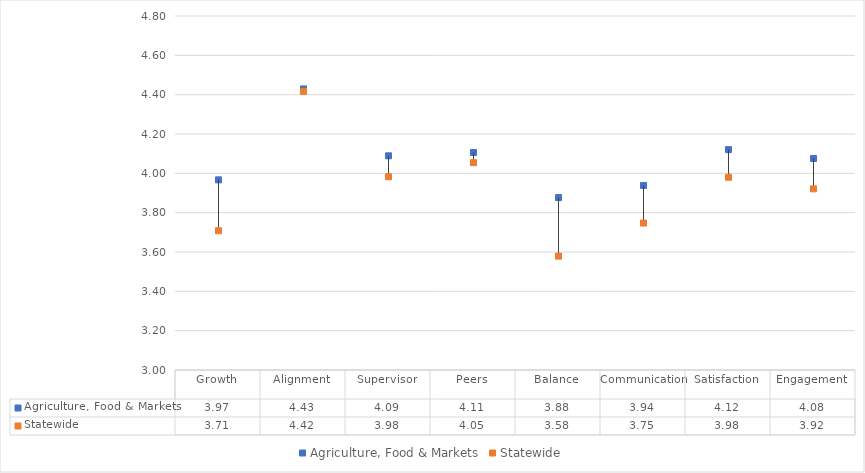
| Category | Agriculture, Food & Markets | Statewide |
|---|---|---|
| Growth | 3.967 | 3.708 |
| Alignment | 4.429 | 4.417 |
| Supervisor | 4.089 | 3.983 |
| Peers | 4.106 | 4.054 |
| Balance | 3.877 | 3.579 |
| Communication | 3.938 | 3.747 |
| Satisfaction | 4.121 | 3.98 |
| Engagement | 4.075 | 3.921 |